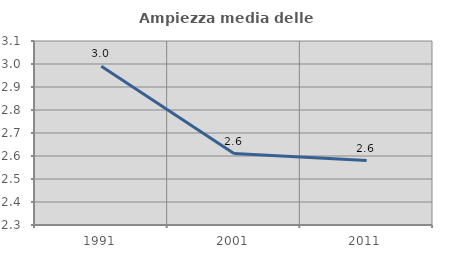
| Category | Ampiezza media delle famiglie |
|---|---|
| 1991.0 | 2.991 |
| 2001.0 | 2.61 |
| 2011.0 | 2.58 |